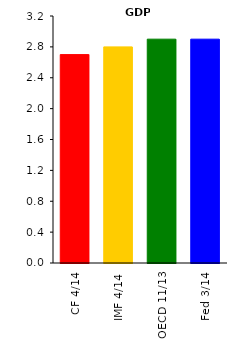
| Category | GDP |
|---|---|
| CF 4/14 | 2.7 |
| IMF 4/14 | 2.8 |
| OECD 11/13 | 2.9 |
| Fed 3/14 | 2.9 |